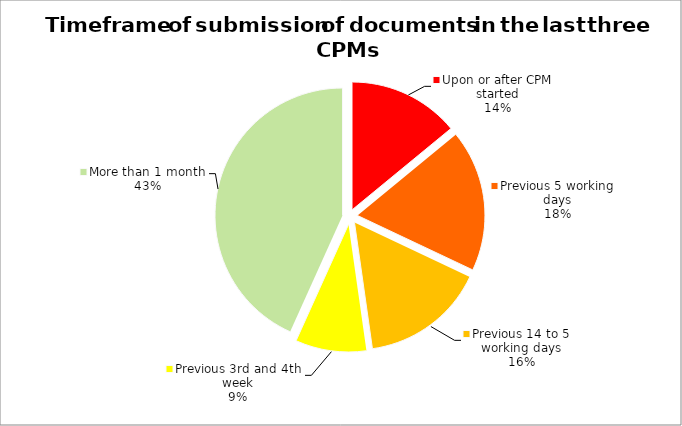
| Category | Series 0 | Series 1 |
|---|---|---|
| Upon or after CPM started | 25 | 0.14 |
| Previous 5 working days | 32 | 0.18 |
| Previous 14 to 5 working days | 28 | 0.157 |
| Previous 3rd and 4th week | 16 | 0.09 |
| More than 1 month | 77 | 0.433 |